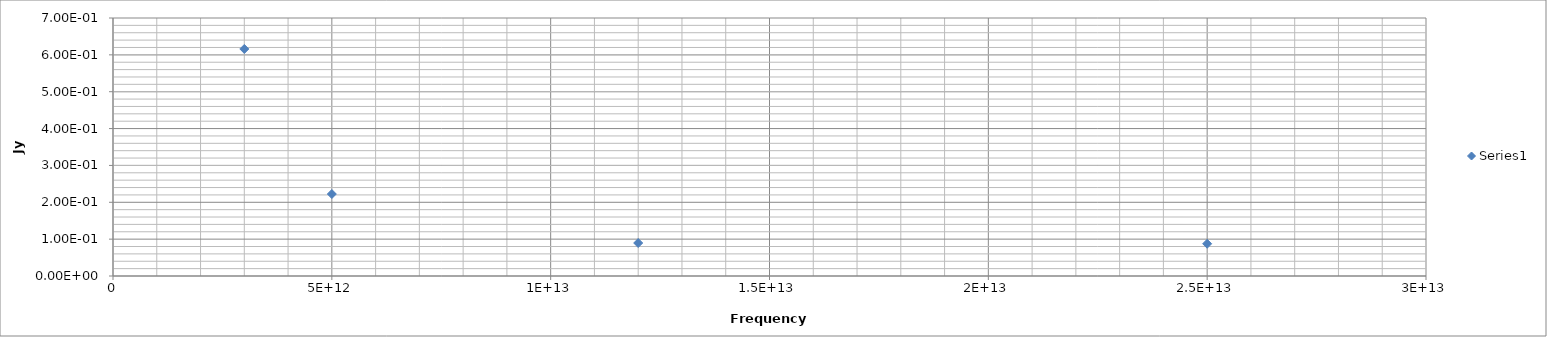
| Category | Series 0 |
|---|---|
| 25000000000000.0 | 0.087 |
| 12000000000000.0 | 0.09 |
| 5000000000000.0 | 0.222 |
| 3000000000000.0 | 0.616 |